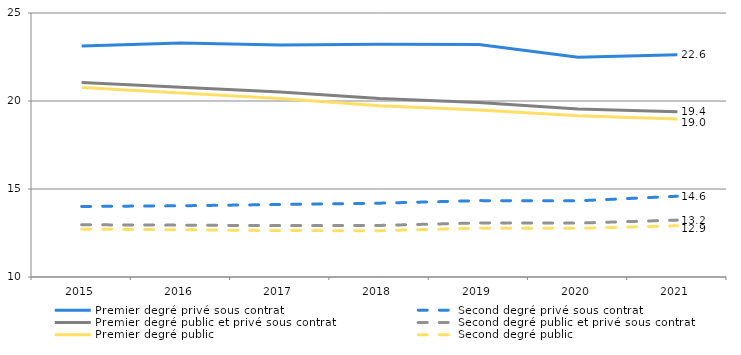
| Category | Premier degré privé sous contrat | Second degré privé sous contrat | Premier degré public et privé sous contrat | Second degré public et privé sous contrat | Premier degré public | Second degré public |
|---|---|---|---|---|---|---|
| 2015.0 | 23.129 | 14.008 | 21.053 | 12.967 | 20.77 | 12.72 |
| 2016.0 | 23.296 | 14.047 | 20.788 | 12.946 | 20.451 | 12.685 |
| 2017.0 | 23.188 | 14.119 | 20.504 | 12.919 | 20.145 | 12.637 |
| 2018.0 | 23.218 | 14.194 | 20.136 | 12.929 | 19.731 | 12.633 |
| 2019.0 | 23.209 | 14.34 | 19.915 | 13.074 | 19.488 | 12.776 |
| 2020.0 | 22.48 | 14.327 | 19.541 | 13.063 | 19.156 | 12.765 |
| 2021.0 | 22.628 | 14.589 | 19.395 | 13.232 | 18.976 | 12.912 |